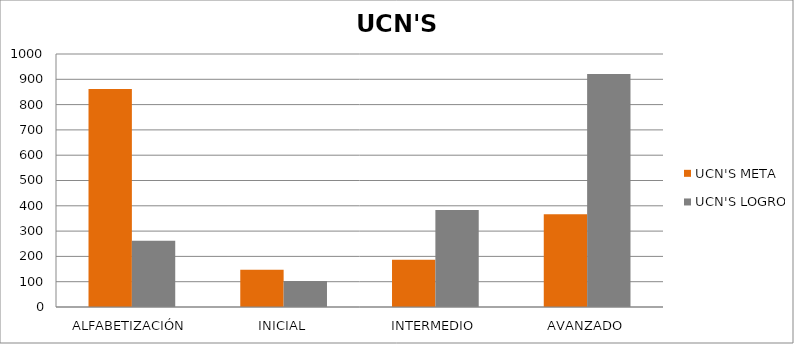
| Category | UCN'S META | UCN'S LOGRO |
|---|---|---|
| ALFABETIZACIÓN | 862 | 262 |
| INICIAL | 147 | 103 |
| INTERMEDIO | 187 | 383 |
| AVANZADO | 367 | 921 |